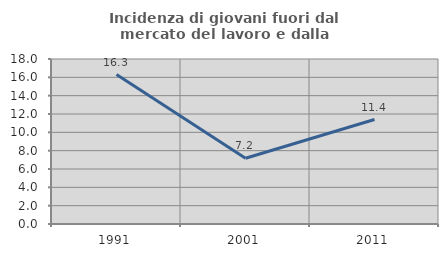
| Category | Incidenza di giovani fuori dal mercato del lavoro e dalla formazione  |
|---|---|
| 1991.0 | 16.308 |
| 2001.0 | 7.173 |
| 2011.0 | 11.399 |